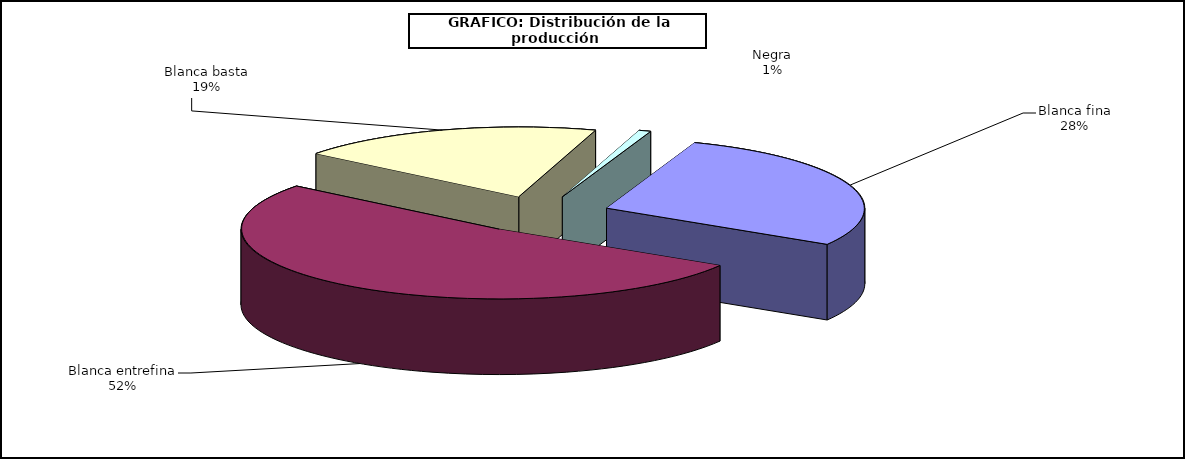
| Category | Series 0 |
|---|---|
| 0 | 6395.151 |
| 1 | 11801.374 |
| 2 | 4357.252 |
| 3 | 169.964 |